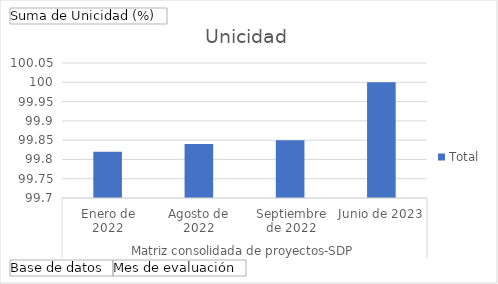
| Category | Total |
|---|---|
| 0 | 99.82 |
| 1 | 99.84 |
| 2 | 99.85 |
| 3 | 100 |